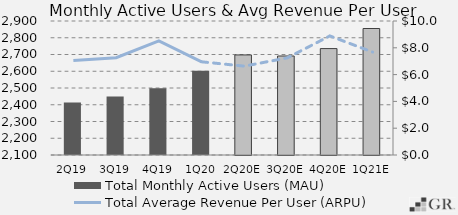
| Category | Total Monthly Active Users (MAU)  |
|---|---|
|  2Q19  | 2414 |
|  3Q19  | 2449 |
|  4Q19  | 2497.8 |
|  1Q20  | 2603 |
|  2Q20E  | 2697.44 |
|  3Q20E  | 2691.122 |
|  4Q20E  | 2735.289 |
|  1Q21E  | 2855.213 |